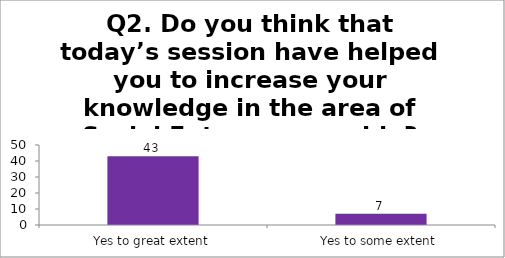
| Category | Q2. Do you think that today’s session have helped you to increase your knowledge in the area of Social Entrepreneurship? |
|---|---|
| Yes to great extent | 43 |
| Yes to some extent | 7 |